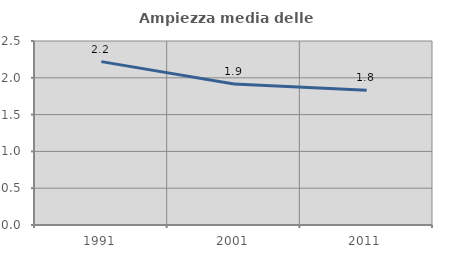
| Category | Ampiezza media delle famiglie |
|---|---|
| 1991.0 | 2.22 |
| 2001.0 | 1.916 |
| 2011.0 | 1.83 |